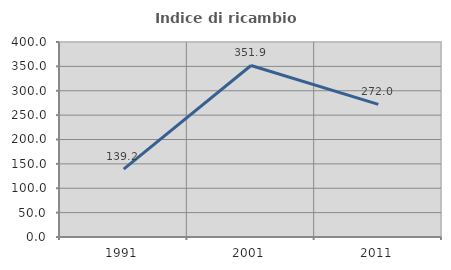
| Category | Indice di ricambio occupazionale  |
|---|---|
| 1991.0 | 139.216 |
| 2001.0 | 351.852 |
| 2011.0 | 272 |